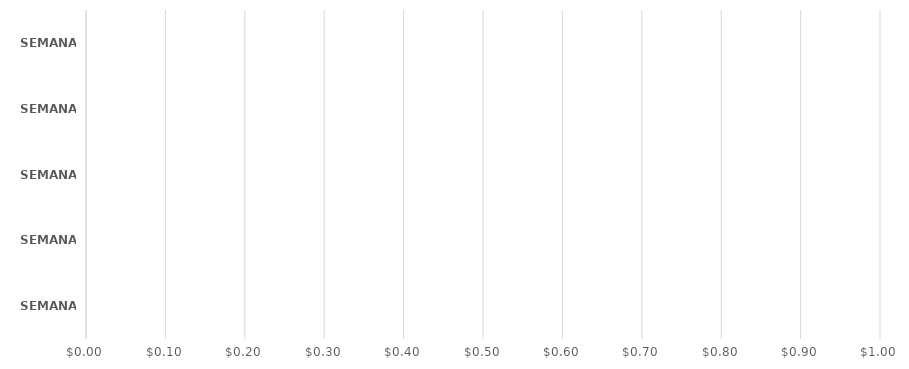
| Category | Series 0 |
|---|---|
| SEMANA 1 | 0 |
| SEMANA 2 | 0 |
| SEMANA 3 | 0 |
| SEMANA 4 | 0 |
| SEMANA 5 | 0 |